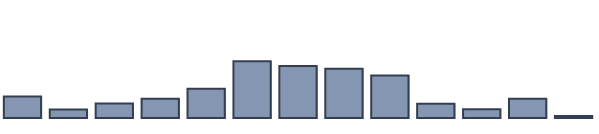
| Category | Series 0 |
|---|---|
| 0 | 6.4 |
| 1 | 2.5 |
| 2 | 4.3 |
| 3 | 5.7 |
| 4 | 8.7 |
| 5 | 16.8 |
| 6 | 15.4 |
| 7 | 14.6 |
| 8 | 12.6 |
| 9 | 4.2 |
| 10 | 2.6 |
| 11 | 5.7 |
| 12 | 0.6 |